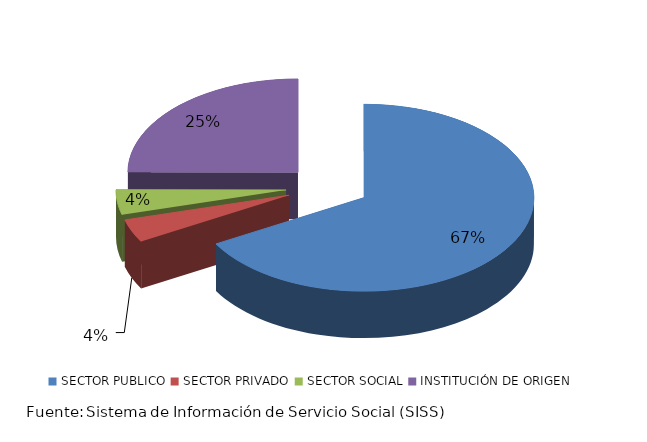
| Category | Series 0 |
|---|---|
| SECTOR PUBLICO | 1396 |
| SECTOR PRIVADO | 83 |
| SECTOR SOCIAL | 90 |
| INSTITUCIÓN DE ORIGEN | 522 |